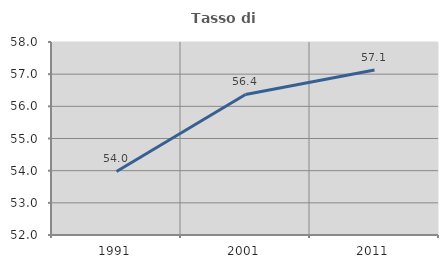
| Category | Tasso di occupazione   |
|---|---|
| 1991.0 | 53.976 |
| 2001.0 | 56.37 |
| 2011.0 | 57.131 |